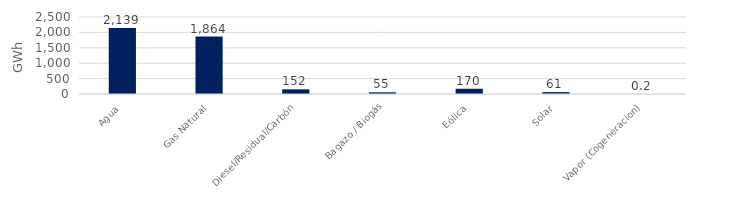
| Category | Series 0 |
|---|---|
| Agua | 2139.413 |
| Gas Natural | 1863.51 |
| Diesel/Residual/Carbón | 152.058 |
| Bagazo / Biogás | 54.789 |
| Eólica | 169.568 |
| Solar | 61.047 |
| Vapor (Cogeneracion) | 0.21 |